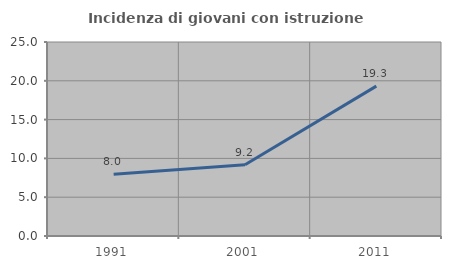
| Category | Incidenza di giovani con istruzione universitaria |
|---|---|
| 1991.0 | 7.971 |
| 2001.0 | 9.178 |
| 2011.0 | 19.31 |